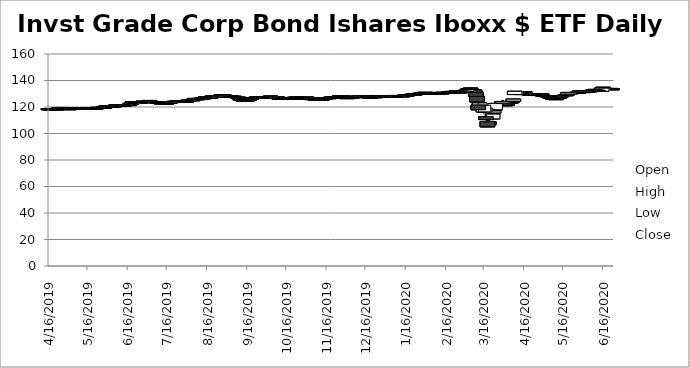
| Category | Open | High | Low | Close |
|---|---|---|---|---|
| 6/23/20 | 133.7 | 134.07 | 133.67 | 133.755 |
| 6/22/20 | 133.99 | 134.31 | 133.6 | 133.86 |
| 6/19/20 | 133.96 | 134.195 | 133.625 | 133.99 |
| 6/18/20 | 133.62 | 133.92 | 133.36 | 133.89 |
| 6/17/20 | 134 | 134.11 | 132.81 | 133.59 |
| 6/16/20 | 134.89 | 134.9 | 133.48 | 133.85 |
| 6/15/20 | 131.89 | 134.829 | 131.82 | 134.22 |
| 6/12/20 | 132.73 | 132.97 | 131.79 | 132.34 |
| 6/11/20 | 132.59 | 132.81 | 131.13 | 131.7 |
| 6/10/20 | 132.66 | 133.51 | 132.1 | 133.29 |
| 6/9/20 | 132.77 | 132.85 | 132.35 | 132.42 |
| 6/8/20 | 132.49 | 132.92 | 132.31 | 132.7 |
| 6/5/20 | 132.09 | 132.45 | 131.5 | 132.26 |
| 6/4/20 | 132.14 | 132.3 | 131.5 | 131.58 |
| 6/3/20 | 132.07 | 132.28 | 131.599 | 131.98 |
| 6/2/20 | 131.82 | 132.31 | 131.73 | 132.06 |
| 6/1/20 | 131.4 | 131.65 | 131.25 | 131.64 |
| 5/29/20 | 131.36 | 132.04 | 131.16 | 132.02 |
| 5/28/20 | 130.93 | 131.375 | 130.6 | 131.17 |
| 5/27/20 | 130.93 | 131.11 | 130.7 | 131.06 |
| 5/26/20 | 130.92 | 131.15 | 130.47 | 130.52 |
| 5/22/20 | 130.72 | 130.98 | 130.52 | 130.7 |
| 5/21/20 | 130.99 | 130.995 | 130.55 | 130.7 |
| 5/20/20 | 129.76 | 130.86 | 129.65 | 130.8 |
| 5/19/20 | 129.33 | 129.66 | 128.9 | 129.38 |
| 5/18/20 | 128.86 | 130 | 128.86 | 129.28 |
| 5/15/20 | 128.1 | 128.61 | 127.97 | 128.55 |
| 5/14/20 | 127.5 | 128.12 | 127 | 128.1 |
| 5/13/20 | 127.29 | 127.56 | 126.94 | 127.05 |
| 5/12/20 | 127.17 | 127.2 | 126.185 | 126.76 |
| 5/11/20 | 126.38 | 126.53 | 125.52 | 125.55 |
| 5/8/20 | 126.82 | 127.08 | 126.368 | 126.66 |
| 5/7/20 | 127.29 | 127.5 | 126.89 | 127.27 |
| 5/6/20 | 127.89 | 127.95 | 126.71 | 126.93 |
| 5/5/20 | 128.39 | 128.72 | 128.16 | 128.37 |
| 5/4/20 | 128.53 | 128.95 | 128.36 | 128.54 |
| 5/1/20 | 128.7 | 128.936 | 127.83 | 128.34 |
| 4/30/20 | 129.73 | 130.15 | 129.11 | 129.17 |
| 4/29/20 | 129.84 | 130.23 | 129.7 | 130.05 |
| 4/28/20 | 129.4 | 129.56 | 129.07 | 129.2 |
| 4/27/20 | 129.98 | 130.1 | 128.82 | 128.85 |
| 4/24/20 | 129.78 | 130.2 | 129.214 | 129.9 |
| 4/23/20 | 129.92 | 130.24 | 129.7 | 129.99 |
| 4/22/20 | 129.36 | 129.598 | 128.91 | 129.44 |
| 4/21/20 | 129.7 | 130.13 | 128.69 | 129.36 |
| 4/20/20 | 130.03 | 130.13 | 129.23 | 129.82 |
| 4/17/20 | 131.33 | 131.47 | 129.94 | 130.56 |
| 4/16/20 | 130.62 | 131.07 | 130.04 | 130.13 |
| 4/15/20 | 129.4 | 130.88 | 129.4 | 130.78 |
| 4/14/20 | 131.4 | 131.5 | 129.84 | 129.91 |
| 4/13/20 | 131.19 | 131.46 | 129.81 | 130.55 |
| 4/9/20 | 129.41 | 132 | 129.1 | 131.83 |
| 4/8/20 | 124.33 | 126.01 | 123.88 | 125.91 |
| 4/7/20 | 124.3 | 124.48 | 123.47 | 123.68 |
| 4/6/20 | 122.63 | 123.5 | 122.23 | 123.49 |
| 4/3/20 | 122.02 | 122.24 | 120.68 | 121.1 |
| 4/2/20 | 121.66 | 123.5 | 121.51 | 121.73 |
| 4/1/20 | 122.55 | 122.6 | 121.315 | 121.41 |
| 3/31/20 | 124.09 | 124.91 | 122.99 | 123.51 |
| 3/30/20 | 122.84 | 125 | 122.84 | 123.92 |
| 3/27/20 | 121.58 | 122.62 | 120.56 | 122.43 |
| 3/26/20 | 122.5 | 123.33 | 121.25 | 122.68 |
| 3/25/20 | 117.89 | 123.6 | 117.186 | 122.58 |
| 3/24/20 | 115.54 | 118.72 | 114.85 | 116.98 |
| 3/23/20 | 111.07 | 115.14 | 110.83 | 114.63 |
| 3/20/20 | 108.87 | 110.64 | 105.797 | 106.74 |
| 3/19/20 | 109.08 | 110 | 104.95 | 105.05 |
| 3/18/20 | 112.72 | 114.705 | 108.32 | 110.51 |
| 3/17/20 | 119.45 | 121.05 | 115.39 | 116.33 |
| 3/16/20 | 116.32 | 122.05 | 115.21 | 121.3 |
| 3/13/20 | 121.49 | 124 | 119.24 | 123.05 |
| 3/12/20 | 121.43 | 125.8 | 115.72 | 117.94 |
| 3/11/20 | 128.08 | 128.27 | 123.2 | 123.85 |
| 3/10/20 | 130.91 | 131.36 | 128.06 | 128.06 |
| 3/9/20 | 132.87 | 133.22 | 130.35 | 131.01 |
| 3/6/20 | 134.2 | 134.53 | 133.49 | 134.27 |
| 3/5/20 | 133.72 | 133.87 | 133.06 | 133.34 |
| 3/4/20 | 133.61 | 134.06 | 133.25 | 133.39 |
| 3/3/20 | 131.83 | 133.99 | 131.75 | 133.2 |
| 3/2/20 | 131.87 | 132.51 | 131.6 | 131.7 |
| 2/28/20 | 131.01 | 132.29 | 130.76 | 132.18 |
| 2/27/20 | 131.63 | 131.9 | 130.69 | 130.71 |
| 2/26/20 | 131.5 | 132.04 | 131.4 | 131.41 |
| 2/25/20 | 131.9 | 132.2 | 131.75 | 131.9 |
| 2/24/20 | 132.02 | 132.16 | 131.76 | 131.77 |
| 2/21/20 | 131.78 | 132.05 | 131.67 | 131.75 |
| 2/20/20 | 131.16 | 131.49 | 131.14 | 131.49 |
| 2/19/20 | 131.12 | 131.29 | 131.01 | 131.05 |
| 2/18/20 | 131.13 | 131.35 | 131.03 | 131.23 |
| 2/14/20 | 131.06 | 131.135 | 130.85 | 130.98 |
| 2/13/20 | 130.75 | 130.905 | 130.635 | 130.66 |
| 2/12/20 | 130.7 | 130.81 | 130.6 | 130.75 |
| 2/11/20 | 130.89 | 131.07 | 130.79 | 130.81 |
| 2/10/20 | 130.9 | 131.06 | 130.8 | 131 |
| 2/7/20 | 130.72 | 130.89 | 130.58 | 130.69 |
| 2/6/20 | 130.29 | 130.44 | 130.18 | 130.19 |
| 2/5/20 | 130.17 | 130.31 | 130.085 | 130.25 |
| 2/4/20 | 130.42 | 130.5 | 130.13 | 130.33 |
| 2/3/20 | 130.58 | 130.81 | 130.42 | 130.65 |
| 1/31/20 | 130.96 | 131.16 | 130.774 | 131.09 |
| 1/30/20 | 130.72 | 130.95 | 130.47 | 130.75 |
| 1/29/20 | 130.6 | 130.88 | 130.59 | 130.67 |
| 1/28/20 | 130.45 | 130.56 | 130.12 | 130.25 |
| 1/27/20 | 130.19 | 130.45 | 130.14 | 130.32 |
| 1/24/20 | 130.13 | 130.22 | 129.96 | 130.07 |
| 1/23/20 | 129.91 | 130 | 129.74 | 129.85 |
| 1/22/20 | 129.84 | 129.88 | 129.67 | 129.68 |
| 1/21/20 | 129.36 | 129.67 | 129.07 | 129.61 |
| 1/17/20 | 128.93 | 129.09 | 128.6 | 128.99 |
| 1/16/20 | 128.9 | 129.113 | 128.75 | 129.01 |
| 1/15/20 | 128.8 | 128.87 | 128.64 | 128.83 |
| 1/14/20 | 128.36 | 128.565 | 128.32 | 128.55 |
| 1/13/20 | 128.52 | 128.55 | 128.33 | 128.39 |
| 1/10/20 | 128.47 | 128.845 | 128.41 | 128.7 |
| 1/9/20 | 127.7 | 128.39 | 127.66 | 128.34 |
| 1/8/20 | 128.01 | 128.32 | 127.67 | 127.73 |
| 1/7/20 | 128.17 | 128.18 | 127.84 | 127.91 |
| 1/6/20 | 128.69 | 128.86 | 128.14 | 128.24 |
| 1/3/20 | 128.4 | 128.71 | 128.27 | 128.67 |
| 1/2/20 | 128.34 | 128.575 | 128.06 | 128.23 |
| 12/31/19 | 128.01 | 128.25 | 127.89 | 127.96 |
| 12/30/19 | 127.9 | 128.5 | 127.775 | 128.49 |
| 12/27/19 | 128.35 | 128.397 | 128.26 | 128.26 |
| 12/26/19 | 128.04 | 128.1 | 127.8 | 128.08 |
| 12/24/19 | 127.56 | 127.96 | 127.5 | 127.85 |
| 12/23/19 | 127.8 | 127.855 | 127.47 | 127.72 |
| 12/20/19 | 127.63 | 127.73 | 127.484 | 127.66 |
| 12/19/19 | 127.57 | 127.84 | 127.5 | 127.7 |
| 12/18/19 | 128.01 | 128.11 | 127.81 | 127.91 |
| 12/17/19 | 128.22 | 128.348 | 127.97 | 128 |
| 12/16/19 | 128.24 | 128.31 | 127.97 | 128.1 |
| 12/13/19 | 128.04 | 128.46 | 127.7 | 128.39 |
| 12/12/19 | 128.09 | 128.13 | 127.165 | 127.56 |
| 12/11/19 | 127.88 | 128.29 | 127.83 | 128.15 |
| 12/10/19 | 127.82 | 127.93 | 127.526 | 127.65 |
| 12/9/19 | 127.98 | 127.99 | 127.62 | 127.65 |
| 12/6/19 | 127.37 | 127.86 | 127.3 | 127.67 |
| 12/5/19 | 127.68 | 127.85 | 127.47 | 127.74 |
| 12/4/19 | 127.85 | 128.02 | 127.46 | 127.88 |
| 12/3/19 | 127.64 | 128.17 | 127.51 | 128.05 |
| 12/2/19 | 127.07 | 127.15 | 126.795 | 127.07 |
| 11/29/19 | 128.18 | 128.255 | 127.84 | 127.97 |
| 11/27/19 | 127.99 | 128.28 | 127.98 | 128.23 |
| 11/26/19 | 128.05 | 128.33 | 128.03 | 128.24 |
| 11/25/19 | 127.64 | 127.98 | 127.63 | 127.91 |
| 11/22/19 | 127.42 | 127.51 | 127.23 | 127.47 |
| 11/21/19 | 127.17 | 127.3 | 127.01 | 127.12 |
| 11/20/19 | 127.41 | 127.545 | 127.31 | 127.42 |
| 11/19/19 | 127.08 | 127.28 | 127.04 | 127.24 |
| 11/18/19 | 127.04 | 127.17 | 126.91 | 126.99 |
| 11/15/19 | 126.74 | 126.99 | 126.6 | 126.85 |
| 11/14/19 | 126.64 | 126.91 | 126.64 | 126.83 |
| 11/13/19 | 126.23 | 126.34 | 126.11 | 126.17 |
| 11/12/19 | 125.86 | 125.97 | 125.61 | 125.87 |
| 11/11/19 | 125.956 | 125.988 | 125.66 | 125.75 |
| 11/8/19 | 125.86 | 126.17 | 125.71 | 125.71 |
| 11/7/19 | 126.32 | 126.44 | 125.74 | 125.88 |
| 11/6/19 | 126.51 | 126.895 | 126.5 | 126.87 |
| 11/5/19 | 126.34 | 126.56 | 126.02 | 126.16 |
| 11/4/19 | 127.15 | 127.18 | 126.85 | 126.89 |
| 11/1/19 | 127.38 | 127.83 | 127.3 | 127.49 |
| 10/31/19 | 127.41 | 127.79 | 127.26 | 127.71 |
| 10/30/19 | 126.46 | 127.01 | 126.43 | 126.94 |
| 10/29/19 | 126.77 | 126.88 | 126.48 | 126.49 |
| 10/28/19 | 126.8 | 126.94 | 126.72 | 126.82 |
| 10/25/19 | 127.48 | 127.48 | 127.03 | 127.2 |
| 10/24/19 | 127.27 | 127.56 | 127.27 | 127.42 |
| 10/23/19 | 127.31 | 127.369 | 127.09 | 127.14 |
| 10/22/19 | 127.24 | 127.26 | 126.875 | 127.07 |
| 10/21/19 | 126.9 | 127 | 126.8 | 126.85 |
| 10/18/19 | 127.14 | 127.34 | 127.05 | 127.14 |
| 10/17/19 | 126.82 | 127.19 | 126.71 | 126.98 |
| 10/16/19 | 126.74 | 126.91 | 126.51 | 126.8 |
| 10/15/19 | 127.05 | 127.05 | 126.57 | 126.66 |
| 10/14/19 | 126.9 | 127.05 | 126.7 | 127 |
| 10/11/19 | 126.49 | 126.77 | 126.055 | 126.58 |
| 10/10/19 | 127.14 | 127.2 | 126.662 | 126.81 |
| 10/9/19 | 127.78 | 127.78 | 127.283 | 127.56 |
| 10/8/19 | 127.91 | 127.99 | 127.475 | 127.51 |
| 10/7/19 | 127.91 | 128 | 127.61 | 127.62 |
| 10/4/19 | 128.03 | 128.27 | 127.95 | 128.27 |
| 10/3/19 | 127.43 | 127.92 | 127.43 | 127.74 |
| 10/2/19 | 127.25 | 127.345 | 126.97 | 127.24 |
| 10/1/19 | 126.56 | 127.66 | 126.56 | 127.29 |
| 9/30/19 | 126.96 | 127.51 | 126.86 | 127.48 |
| 9/27/19 | 127.15 | 127.22 | 126.93 | 127.06 |
| 9/26/19 | 127.19 | 127.27 | 127 | 127.03 |
| 9/25/19 | 127.28 | 127.36 | 126.63 | 126.76 |
| 9/24/19 | 127.41 | 127.65 | 127.29 | 127.48 |
| 9/23/19 | 127.39 | 127.575 | 127.05 | 127.08 |
| 9/20/19 | 126.69 | 127.23 | 126.56 | 127.17 |
| 9/19/19 | 126.41 | 126.612 | 126.21 | 126.3 |
| 9/18/19 | 126.07 | 126.46 | 125.53 | 125.94 |
| 9/17/19 | 125.26 | 125.805 | 125.16 | 125.63 |
| 9/16/19 | 125.13 | 125.43 | 124.93 | 125.31 |
| 9/13/19 | 125.36 | 125.59 | 124.68 | 124.68 |
| 9/12/19 | 126.66 | 126.76 | 125.73 | 125.81 |
| 9/11/19 | 126 | 126.32 | 125.91 | 125.98 |
| 9/10/19 | 126.97 | 126.99 | 126.07 | 126.08 |
| 9/9/19 | 127.47 | 127.56 | 127.15 | 127.15 |
| 9/6/19 | 127.84 | 128.19 | 127.78 | 128.09 |
| 9/5/19 | 127.95 | 128.24 | 127.42 | 127.63 |
| 9/4/19 | 128.07 | 128.71 | 128.07 | 128.57 |
| 9/3/19 | 128.37 | 128.715 | 127.935 | 128.33 |
| 8/30/19 | 128.67 | 128.84 | 128.42 | 128.8 |
| 8/29/19 | 129.06 | 129.1 | 128.35 | 128.82 |
| 8/28/19 | 129.395 | 129.46 | 129.005 | 129.1 |
| 8/27/19 | 128.75 | 129.2 | 128.75 | 129.1 |
| 8/26/19 | 128.48 | 128.715 | 128.21 | 128.41 |
| 8/23/19 | 127.79 | 128.71 | 127.77 | 128.4 |
| 8/22/19 | 128.25 | 128.5 | 127.88 | 127.93 |
| 8/21/19 | 127.87 | 128.73 | 127.87 | 128.4 |
| 8/20/19 | 127.85 | 128.22 | 127.72 | 128.17 |
| 8/19/19 | 127.17 | 127.615 | 127.001 | 127.43 |
| 8/16/19 | 127.32 | 127.895 | 127.065 | 127.85 |
| 8/15/19 | 127.15 | 128 | 127.05 | 127.62 |
| 8/14/19 | 127.1 | 127.2 | 126.83 | 127 |
| 8/13/19 | 126.82 | 126.95 | 126.45 | 126.63 |
| 8/12/19 | 126.3 | 126.83 | 126.26 | 126.73 |
| 8/9/19 | 126.31 | 126.351 | 125.89 | 125.94 |
| 8/8/19 | 125.78 | 126.36 | 125.53 | 126.31 |
| 8/7/19 | 126.47 | 126.66 | 125.86 | 125.97 |
| 8/6/19 | 125.58 | 126.04 | 125.33 | 125.99 |
| 8/5/19 | 125.51 | 125.51 | 125.13 | 125.21 |
| 8/2/19 | 124.95 | 125.15 | 124.84 | 125.12 |
| 8/1/19 | 124.31 | 125.31 | 124.22 | 124.99 |
| 7/31/19 | 124.35 | 124.73 | 123.811 | 124.33 |
| 7/30/19 | 124.22 | 124.31 | 123.92 | 124.22 |
| 7/29/19 | 124.49 | 124.51 | 124.245 | 124.26 |
| 7/26/19 | 124.43 | 124.49 | 124.17 | 124.34 |
| 7/25/19 | 124.41 | 124.49 | 123.87 | 124.17 |
| 7/24/19 | 124.39 | 124.58 | 124.22 | 124.57 |
| 7/23/19 | 124.24 | 124.24 | 123.97 | 124.22 |
| 7/22/19 | 124.25 | 124.27 | 124.09 | 124.15 |
| 7/19/19 | 123.83 | 124.06 | 123.65 | 123.77 |
| 7/18/19 | 123.61 | 124.09 | 123.36 | 123.96 |
| 7/17/19 | 123.15 | 123.68 | 123.15 | 123.67 |
| 7/16/19 | 122.85 | 123.04 | 122.71 | 123.02 |
| 7/15/19 | 123.2 | 123.34 | 123.093 | 123.28 |
| 7/12/19 | 122.9 | 123.14 | 122.84 | 123.07 |
| 7/11/19 | 123.45 | 123.636 | 122.85 | 122.95 |
| 7/10/19 | 123.55 | 123.84 | 123.48 | 123.68 |
| 7/9/19 | 123.59 | 123.62 | 123.34 | 123.4 |
| 7/8/19 | 124 | 124.05 | 123.66 | 123.66 |
| 7/5/19 | 124.04 | 124.15 | 123.34 | 123.83 |
| 7/3/19 | 124.65 | 124.96 | 124.59 | 124.93 |
| 7/2/19 | 124.25 | 124.65 | 124.2 | 124.59 |
| 7/1/19 | 124.21 | 124.54 | 123.94 | 124.25 |
| 6/28/19 | 124.11 | 124.44 | 124.085 | 124.37 |
| 6/27/19 | 123.64 | 124.14 | 123.54 | 124.05 |
| 6/26/19 | 123.84 | 123.84 | 123.28 | 123.33 |
| 6/25/19 | 123.95 | 123.99 | 123.47 | 123.58 |
| 6/24/19 | 123.95 | 124.17 | 123.78 | 123.95 |
| 6/21/19 | 123.68 | 123.89 | 123.483 | 123.64 |
| 6/20/19 | 123.9 | 124.155 | 123.7 | 124.09 |
| 6/19/19 | 122.35 | 123.45 | 122.23 | 123.42 |
| 6/18/19 | 122.46 | 122.77 | 122.34 | 122.64 |
| 6/17/19 | 121.69 | 121.93 | 121.62 | 121.83 |
| 6/14/19 | 121.55 | 121.82 | 121.46 | 121.77 |
| 6/13/19 | 121.45 | 121.75 | 121.45 | 121.72 |
| 6/12/19 | 121.24 | 121.43 | 121.15 | 121.41 |
| 6/11/19 | 121.2 | 121.32 | 121.03 | 121.23 |
| 6/10/19 | 121.34 | 121.47 | 121.11 | 121.12 |
| 6/7/19 | 121.5 | 121.85 | 121.425 | 121.56 |
| 6/6/19 | 120.96 | 121.12 | 120.82 | 121.02 |
| 6/5/19 | 120.97 | 121.18 | 120.68 | 120.79 |
| 6/4/19 | 120.53 | 120.93 | 120.53 | 120.87 |
| 6/3/19 | 120.75 | 120.91 | 120.413 | 120.83 |
| 5/31/19 | 120.62 | 120.84 | 120.39 | 120.83 |
| 5/30/19 | 120.1 | 120.59 | 120.01 | 120.55 |
| 5/29/19 | 119.88 | 120.03 | 119.82 | 119.86 |
| 5/28/19 | 119.93 | 120 | 119.77 | 119.81 |
| 5/24/19 | 119.64 | 119.75 | 119.52 | 119.73 |
| 5/23/19 | 119.25 | 119.61 | 119.18 | 119.48 |
| 5/22/19 | 119.14 | 119.31 | 119.04 | 119.22 |
| 5/21/19 | 119.09 | 119.11 | 118.93 | 119.07 |
| 5/20/19 | 119.22 | 119.313 | 118.96 | 118.97 |
| 5/17/19 | 119.38 | 119.435 | 119.23 | 119.25 |
| 5/16/19 | 119.34 | 119.34 | 119.21 | 119.24 |
| 5/15/19 | 119.41 | 119.45 | 119.18 | 119.43 |
| 5/14/19 | 119 | 119.12 | 118.915 | 119.1 |
| 5/13/19 | 118.86 | 119.13 | 118.78 | 118.93 |
| 5/10/19 | 118.75 | 118.92 | 118.71 | 118.86 |
| 5/9/19 | 118.93 | 118.95 | 118.61 | 118.79 |
| 5/8/19 | 119.15 | 119.2 | 118.64 | 118.68 |
| 5/7/19 | 119.28 | 119.29 | 119 | 119.08 |
| 5/6/19 | 119.03 | 119.23 | 118.88 | 119.09 |
| 5/3/19 | 118.65 | 118.97 | 118.65 | 118.93 |
| 5/2/19 | 118.7 | 118.74 | 118.29 | 118.4 |
| 5/1/19 | 119 | 119.57 | 118.83 | 118.83 |
| 4/30/19 | 119.15 | 119.35 | 119.1 | 119.22 |
| 4/29/19 | 119.38 | 119.43 | 119.105 | 119.17 |
| 4/26/19 | 119.62 | 119.71 | 119.5 | 119.64 |
| 4/25/19 | 119.17 | 119.27 | 119.025 | 119.22 |
| 4/24/19 | 119.16 | 119.4 | 119.13 | 119.28 |
| 4/23/19 | 118.56 | 118.88 | 118.54 | 118.88 |
| 4/22/19 | 118.46 | 118.53 | 118.34 | 118.39 |
| 4/18/19 | 118.75 | 118.8 | 118.55 | 118.58 |
| 4/17/19 | 118.62 | 118.72 | 118.47 | 118.48 |
| 4/16/19 | 118.79 | 118.79 | 118.49 | 118.5 |